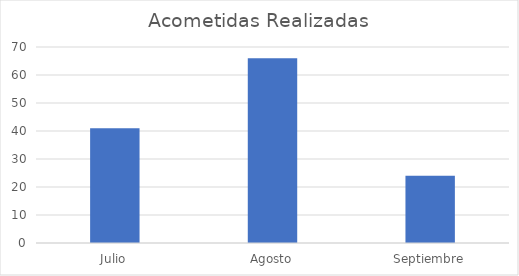
| Category | Acometidas Realizadas |
|---|---|
| Julio | 41 |
| Agosto | 66 |
| Septiembre | 24 |